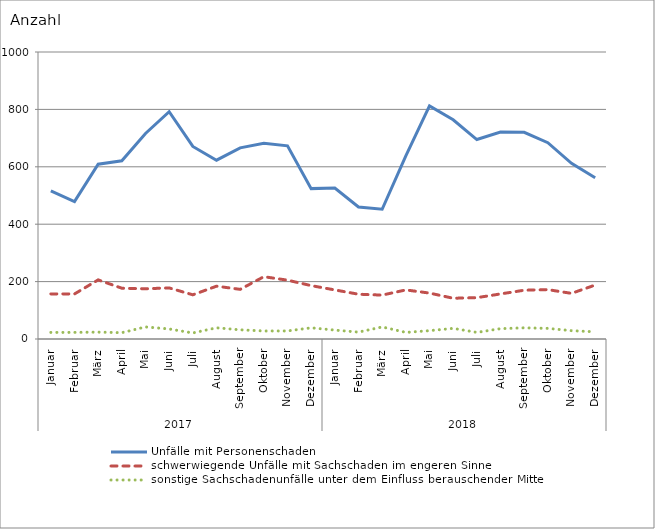
| Category | Unfälle mit Personenschaden | schwerwiegende Unfälle mit Sachschaden im engeren Sinne | sonstige Sachschadenunfälle unter dem Einfluss berauschender Mittel |
|---|---|---|---|
| 0 | 516 | 157 | 23 |
| 1 | 479 | 157 | 23 |
| 2 | 609 | 206 | 24 |
| 3 | 621 | 177 | 22 |
| 4 | 716 | 175 | 42 |
| 5 | 792 | 178 | 35 |
| 6 | 671 | 154 | 21 |
| 7 | 623 | 184 | 39 |
| 8 | 666 | 173 | 32 |
| 9 | 682 | 217 | 28 |
| 10 | 673 | 205 | 28 |
| 11 | 524 | 186 | 39 |
| 12 | 526 | 171 | 31 |
| 13 | 460 | 156 | 24 |
| 14 | 452 | 153 | 42 |
| 15 | 638 | 171 | 23 |
| 16 | 812 | 160 | 29 |
| 17 | 764 | 142 | 37 |
| 18 | 695 | 144 | 23 |
| 19 | 721 | 157 | 36 |
| 20 | 720 | 170 | 39 |
| 21 | 684 | 172 | 37 |
| 22 | 612 | 159 | 29 |
| 23 | 562 | 188 | 25 |